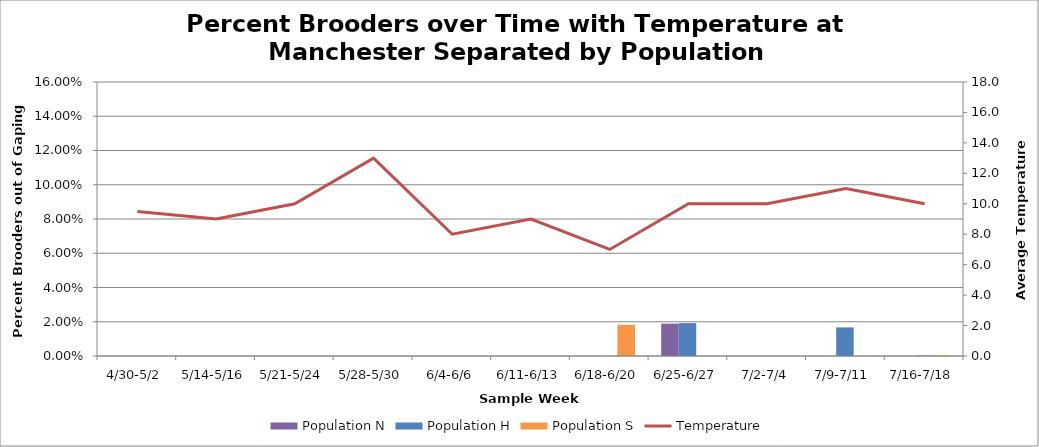
| Category | Population N | Population H | Population S |
|---|---|---|---|
| 4/30-5/2 | 0 | 0 | 0 |
| 5/14-5/16 | 0 | 0 | 0 |
| 5/21-5/24 | 0 | 0 | 0 |
| 5/28-5/30 | 0 | 0 | 0 |
| 6/4-6/6 | 0 | 0 | 0 |
| 6/11-6/13 | 0 | 0 | 0 |
| 6/18-6/20 | 0 | 0 | 0.018 |
| 6/25-6/27 | 0.019 | 0.019 | 0 |
| 7/2-7/4 | 0 | 0 | 0 |
| 7/9-7/11 | 0 | 0.017 | 0 |
| 7/16-7/18 | 0 | 0 | 0 |